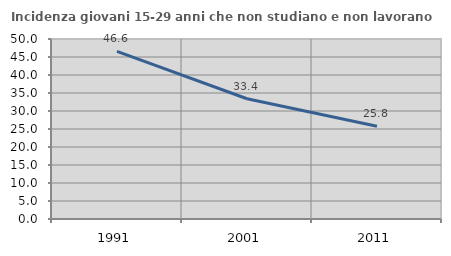
| Category | Incidenza giovani 15-29 anni che non studiano e non lavorano  |
|---|---|
| 1991.0 | 46.557 |
| 2001.0 | 33.409 |
| 2011.0 | 25.765 |